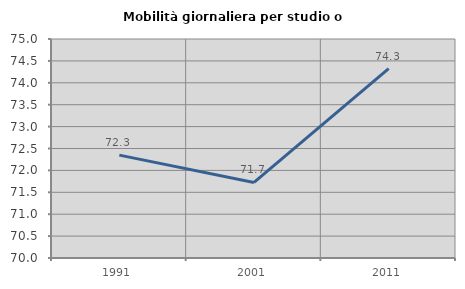
| Category | Mobilità giornaliera per studio o lavoro |
|---|---|
| 1991.0 | 72.349 |
| 2001.0 | 71.724 |
| 2011.0 | 74.322 |